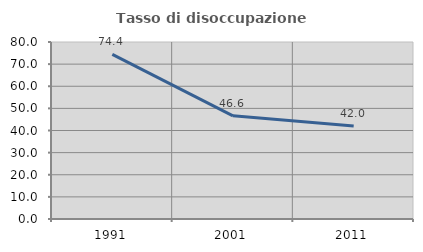
| Category | Tasso di disoccupazione giovanile  |
|---|---|
| 1991.0 | 74.444 |
| 2001.0 | 46.626 |
| 2011.0 | 42.029 |